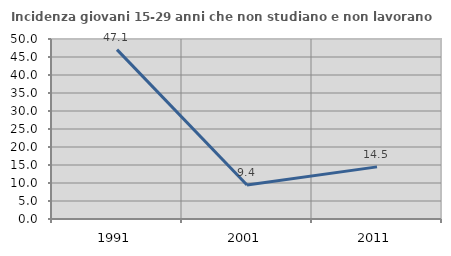
| Category | Incidenza giovani 15-29 anni che non studiano e non lavorano  |
|---|---|
| 1991.0 | 47.051 |
| 2001.0 | 9.422 |
| 2011.0 | 14.48 |